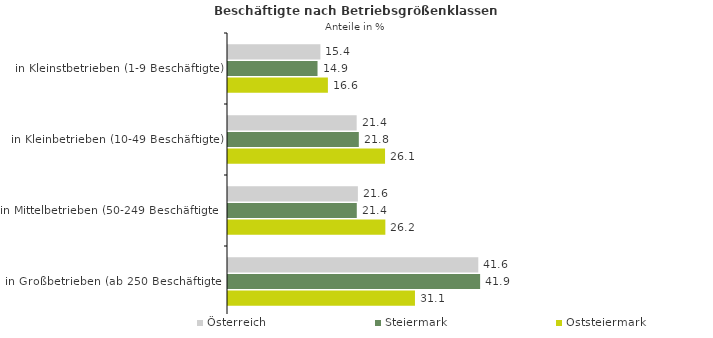
| Category | Österreich | Steiermark | Oststeiermark |
|---|---|---|---|
| in Kleinstbetrieben (1-9 Beschäftigte) | 15.366 | 14.89 | 16.614 |
| in Kleinbetrieben (10-49 Beschäftigte) | 21.402 | 21.759 | 26.119 |
| in Mittelbetrieben (50-249 Beschäftigte) | 21.603 | 21.42 | 26.17 |
| in Großbetrieben (ab 250 Beschäftigte) | 41.629 | 41.932 | 31.096 |